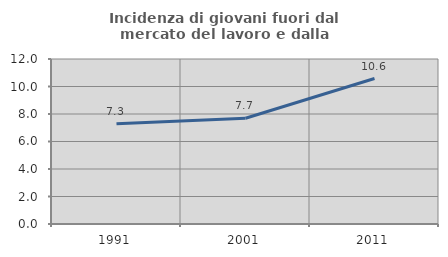
| Category | Incidenza di giovani fuori dal mercato del lavoro e dalla formazione  |
|---|---|
| 1991.0 | 7.29 |
| 2001.0 | 7.692 |
| 2011.0 | 10.58 |